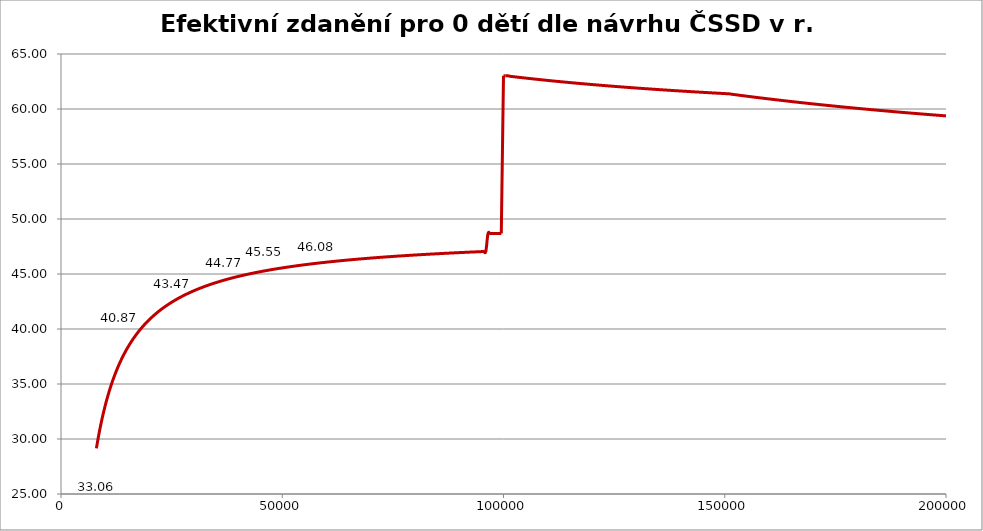
| Category | Efektivní zdanění 2012 |
|---|---|
| 8000.0 | 29.151 |
| 8500.0 | 30.3 |
| 9000.0 | 31.321 |
| 9500.0 | 32.234 |
| 10000.0 | 33.057 |
| 10500.0 | 33.801 |
| 11000.0 | 34.477 |
| 11500.0 | 35.094 |
| 12000.0 | 35.66 |
| 12500.0 | 36.181 |
| 13000.0 | 36.662 |
| 13500.0 | 37.107 |
| 14000.0 | 37.52 |
| 14500.0 | 37.905 |
| 15000.0 | 38.264 |
| 15500.0 | 38.6 |
| 16000.0 | 38.915 |
| 16500.0 | 39.211 |
| 17000.0 | 39.489 |
| 17500.0 | 39.752 |
| 18000.0 | 40 |
| 18500.0 | 40.235 |
| 19000.0 | 40.457 |
| 19500.0 | 40.668 |
| 20000.0 | 40.868 |
| 20500.0 | 41.058 |
| 21000.0 | 41.24 |
| 21500.0 | 41.413 |
| 22000.0 | 41.578 |
| 22500.0 | 41.736 |
| 23000.0 | 41.887 |
| 23500.0 | 42.031 |
| 24000.0 | 42.17 |
| 24500.0 | 42.303 |
| 25000.0 | 42.43 |
| 25500.0 | 42.553 |
| 26000.0 | 42.671 |
| 26500.0 | 42.784 |
| 27000.0 | 42.893 |
| 27500.0 | 42.998 |
| 28000.0 | 43.1 |
| 28500.0 | 43.198 |
| 29000.0 | 43.292 |
| 29500.0 | 43.383 |
| 30000.0 | 43.472 |
| 30500.0 | 43.557 |
| 31000.0 | 43.64 |
| 31500.0 | 43.72 |
| 32000.0 | 43.797 |
| 32500.0 | 43.872 |
| 33000.0 | 43.945 |
| 33500.0 | 44.016 |
| 34000.0 | 44.084 |
| 34500.0 | 44.151 |
| 35000.0 | 44.216 |
| 35500.0 | 44.279 |
| 36000.0 | 44.34 |
| 36500.0 | 44.399 |
| 37000.0 | 44.457 |
| 37500.0 | 44.513 |
| 38000.0 | 44.568 |
| 38500.0 | 44.621 |
| 39000.0 | 44.673 |
| 39500.0 | 44.724 |
| 40000.0 | 44.774 |
| 40500.0 | 44.822 |
| 41000.0 | 44.869 |
| 41500.0 | 44.915 |
| 42000.0 | 44.96 |
| 42500.0 | 45.003 |
| 43000.0 | 45.046 |
| 43500.0 | 45.088 |
| 44000.0 | 45.129 |
| 44500.0 | 45.169 |
| 45000.0 | 45.208 |
| 45500.0 | 45.246 |
| 46000.0 | 45.283 |
| 46500.0 | 45.32 |
| 47000.0 | 45.355 |
| 47500.0 | 45.39 |
| 48000.0 | 45.425 |
| 48500.0 | 45.458 |
| 49000.0 | 45.491 |
| 49500.0 | 45.523 |
| 50000.0 | 45.555 |
| 50500.0 | 45.586 |
| 51000.0 | 45.616 |
| 51500.0 | 45.646 |
| 52000.0 | 45.675 |
| 52500.0 | 45.704 |
| 53000.0 | 45.732 |
| 53500.0 | 45.759 |
| 54000.0 | 45.786 |
| 54500.0 | 45.813 |
| 55000.0 | 45.839 |
| 55500.0 | 45.864 |
| 56000.0 | 45.889 |
| 56500.0 | 45.914 |
| 57000.0 | 45.938 |
| 57500.0 | 45.962 |
| 58000.0 | 45.986 |
| 58500.0 | 46.009 |
| 59000.0 | 46.031 |
| 59500.0 | 46.054 |
| 60000.0 | 46.075 |
| 60500.0 | 46.097 |
| 61000.0 | 46.118 |
| 61500.0 | 46.139 |
| 62000.0 | 46.159 |
| 62500.0 | 46.18 |
| 63000.0 | 46.199 |
| 63500.0 | 46.219 |
| 64000.0 | 46.238 |
| 64500.0 | 46.257 |
| 65000.0 | 46.276 |
| 65500.0 | 46.294 |
| 66000.0 | 46.312 |
| 66500.0 | 46.33 |
| 67000.0 | 46.348 |
| 67500.0 | 46.365 |
| 68000.0 | 46.382 |
| 68500.0 | 46.399 |
| 69000.0 | 46.415 |
| 69500.0 | 46.431 |
| 70000.0 | 46.447 |
| 70500.0 | 46.463 |
| 71000.0 | 46.479 |
| 71500.0 | 46.494 |
| 72000.0 | 46.509 |
| 72500.0 | 46.524 |
| 73000.0 | 46.539 |
| 73500.0 | 46.554 |
| 74000.0 | 46.568 |
| 74500.0 | 46.582 |
| 75000.0 | 46.596 |
| 75500.0 | 46.61 |
| 76000.0 | 46.624 |
| 76500.0 | 46.637 |
| 77000.0 | 46.65 |
| 77500.0 | 46.663 |
| 78000.0 | 46.676 |
| 78500.0 | 46.689 |
| 79000.0 | 46.702 |
| 79500.0 | 46.714 |
| 80000.0 | 46.726 |
| 80500.0 | 46.739 |
| 81000.0 | 46.751 |
| 81500.0 | 46.762 |
| 82000.0 | 46.774 |
| 82500.0 | 46.786 |
| 83000.0 | 46.797 |
| 83500.0 | 46.808 |
| 84000.0 | 46.819 |
| 84500.0 | 46.83 |
| 85000.0 | 46.841 |
| 85500.0 | 46.852 |
| 86000.0 | 46.863 |
| 86500.0 | 46.873 |
| 87000.0 | 46.884 |
| 87500.0 | 46.894 |
| 88000.0 | 46.904 |
| 88500.0 | 46.914 |
| 89000.0 | 46.924 |
| 89500.0 | 46.934 |
| 90000.0 | 46.943 |
| 90500.0 | 46.953 |
| 91000.0 | 46.962 |
| 91500.0 | 46.972 |
| 92000.0 | 46.981 |
| 92500.0 | 46.99 |
| 93000.0 | 46.999 |
| 93500.0 | 47.008 |
| 94000.0 | 47.017 |
| 94500.0 | 47.026 |
| 95000.0 | 47.035 |
| 95500.0 | 47.043 |
| 96000.0 | 47.052 |
| 96500.0 | 48.679 |
| 97000.0 | 48.679 |
| 97500.0 | 48.679 |
| 98000.0 | 48.679 |
| 98500.0 | 48.679 |
| 99000.0 | 48.679 |
| 99500.0 | 48.679 |
| 100000.0 | 63.019 |
| 100500.0 | 63.019 |
| 101000.0 | 63.019 |
| 101500.0 | 62.973 |
| 102000.0 | 62.949 |
| 102500.0 | 62.925 |
| 103000.0 | 62.902 |
| 103500.0 | 62.879 |
| 104000.0 | 62.856 |
| 104500.0 | 62.833 |
| 105000.0 | 62.811 |
| 105500.0 | 62.789 |
| 106000.0 | 62.767 |
| 106500.0 | 62.745 |
| 107000.0 | 62.723 |
| 107500.0 | 62.702 |
| 108000.0 | 62.68 |
| 108500.0 | 62.659 |
| 109000.0 | 62.638 |
| 109500.0 | 62.618 |
| 110000.0 | 62.597 |
| 110500.0 | 62.577 |
| 111000.0 | 62.557 |
| 111500.0 | 62.537 |
| 112000.0 | 62.517 |
| 112500.0 | 62.498 |
| 113000.0 | 62.478 |
| 113500.0 | 62.459 |
| 114000.0 | 62.44 |
| 114500.0 | 62.421 |
| 115000.0 | 62.402 |
| 115500.0 | 62.384 |
| 116000.0 | 62.365 |
| 116500.0 | 62.347 |
| 117000.0 | 62.329 |
| 117500.0 | 62.311 |
| 118000.0 | 62.293 |
| 118500.0 | 62.276 |
| 119000.0 | 62.258 |
| 119500.0 | 62.241 |
| 120000.0 | 62.224 |
| 120500.0 | 62.207 |
| 121000.0 | 62.19 |
| 121500.0 | 62.173 |
| 122000.0 | 62.156 |
| 122500.0 | 62.14 |
| 123000.0 | 62.123 |
| 123500.0 | 62.107 |
| 124000.0 | 62.091 |
| 124500.0 | 62.075 |
| 125000.0 | 62.059 |
| 125500.0 | 62.043 |
| 126000.0 | 62.028 |
| 126500.0 | 62.012 |
| 127000.0 | 61.997 |
| 127500.0 | 61.982 |
| 128000.0 | 61.967 |
| 128500.0 | 61.952 |
| 129000.0 | 61.937 |
| 129500.0 | 61.922 |
| 130000.0 | 61.907 |
| 130500.0 | 61.893 |
| 131000.0 | 61.878 |
| 131500.0 | 61.864 |
| 132000.0 | 61.85 |
| 132500.0 | 61.836 |
| 133000.0 | 61.822 |
| 133500.0 | 61.808 |
| 134000.0 | 61.794 |
| 134500.0 | 61.78 |
| 135000.0 | 61.767 |
| 135500.0 | 61.753 |
| 136000.0 | 61.74 |
| 136500.0 | 61.727 |
| 137000.0 | 61.714 |
| 137500.0 | 61.7 |
| 138000.0 | 61.687 |
| 138500.0 | 61.675 |
| 139000.0 | 61.662 |
| 139500.0 | 61.649 |
| 140000.0 | 61.636 |
| 140500.0 | 61.624 |
| 141000.0 | 61.611 |
| 141500.0 | 61.599 |
| 142000.0 | 61.587 |
| 142500.0 | 61.575 |
| 143000.0 | 61.563 |
| 143500.0 | 61.55 |
| 144000.0 | 61.539 |
| 144500.0 | 61.527 |
| 145000.0 | 61.515 |
| 145500.0 | 61.503 |
| 146000.0 | 61.492 |
| 146500.0 | 61.48 |
| 147000.0 | 61.469 |
| 147500.0 | 61.457 |
| 148000.0 | 61.446 |
| 148500.0 | 61.435 |
| 149000.0 | 61.424 |
| 149500.0 | 61.413 |
| 150000.0 | 61.402 |
| 150500.0 | 61.391 |
| 151000.0 | 61.38 |
| 151500.0 | 61.347 |
| 152000.0 | 61.32 |
| 152500.0 | 61.294 |
| 153000.0 | 61.267 |
| 153500.0 | 61.241 |
| 154000.0 | 61.215 |
| 154500.0 | 61.189 |
| 155000.0 | 61.163 |
| 155500.0 | 61.138 |
| 156000.0 | 61.112 |
| 156500.0 | 61.087 |
| 157000.0 | 61.062 |
| 157500.0 | 61.037 |
| 158000.0 | 61.012 |
| 158500.0 | 60.988 |
| 159000.0 | 60.963 |
| 159500.0 | 60.939 |
| 160000.0 | 60.915 |
| 160500.0 | 60.891 |
| 161000.0 | 60.867 |
| 161500.0 | 60.843 |
| 162000.0 | 60.819 |
| 162500.0 | 60.796 |
| 163000.0 | 60.773 |
| 163500.0 | 60.75 |
| 164000.0 | 60.727 |
| 164500.0 | 60.704 |
| 165000.0 | 60.681 |
| 165500.0 | 60.658 |
| 166000.0 | 60.636 |
| 166500.0 | 60.614 |
| 167000.0 | 60.592 |
| 167500.0 | 60.57 |
| 168000.0 | 60.548 |
| 168500.0 | 60.526 |
| 169000.0 | 60.504 |
| 169500.0 | 60.483 |
| 170000.0 | 60.461 |
| 170500.0 | 60.44 |
| 171000.0 | 60.419 |
| 171500.0 | 60.398 |
| 172000.0 | 60.377 |
| 172500.0 | 60.356 |
| 173000.0 | 60.335 |
| 173500.0 | 60.315 |
| 174000.0 | 60.295 |
| 174500.0 | 60.274 |
| 175000.0 | 60.254 |
| 175500.0 | 60.234 |
| 176000.0 | 60.214 |
| 176500.0 | 60.194 |
| 177000.0 | 60.174 |
| 177500.0 | 60.155 |
| 178000.0 | 60.135 |
| 178500.0 | 60.116 |
| 179000.0 | 60.097 |
| 179500.0 | 60.077 |
| 180000.0 | 60.058 |
| 180500.0 | 60.039 |
| 181000.0 | 60.02 |
| 181500.0 | 60.002 |
| 182000.0 | 59.983 |
| 182500.0 | 59.964 |
| 183000.0 | 59.946 |
| 183500.0 | 59.928 |
| 184000.0 | 59.909 |
| 184500.0 | 59.891 |
| 185000.0 | 59.873 |
| 185500.0 | 59.855 |
| 186000.0 | 59.837 |
| 186500.0 | 59.82 |
| 187000.0 | 59.802 |
| 187500.0 | 59.784 |
| 188000.0 | 59.767 |
| 188500.0 | 59.749 |
| 189000.0 | 59.732 |
| 189500.0 | 59.715 |
| 190000.0 | 59.698 |
| 190500.0 | 59.681 |
| 191000.0 | 59.664 |
| 191500.0 | 59.647 |
| 192000.0 | 59.63 |
| 192500.0 | 59.613 |
| 193000.0 | 59.597 |
| 193500.0 | 59.58 |
| 194000.0 | 59.564 |
| 194500.0 | 59.548 |
| 195000.0 | 59.531 |
| 195500.0 | 59.515 |
| 196000.0 | 59.499 |
| 196500.0 | 59.483 |
| 197000.0 | 59.467 |
| 197500.0 | 59.451 |
| 198000.0 | 59.435 |
| 198500.0 | 59.42 |
| 199000.0 | 59.404 |
| 199500.0 | 59.389 |
| 200000.0 | 59.373 |